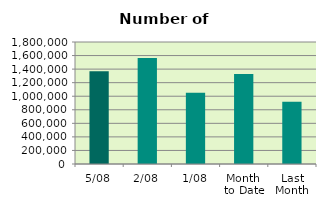
| Category | Series 0 |
|---|---|
| 5/08 | 1366636 |
| 2/08 | 1562168 |
| 1/08 | 1051442 |
| Month 
to Date | 1326748.667 |
| Last
Month | 919173.478 |